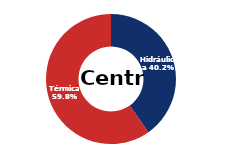
| Category | Centro |
|---|---|
| Eólica | 0 |
| Hidráulica | 1597.589 |
| Solar | 0.006 |
| Térmica | 2373.296 |